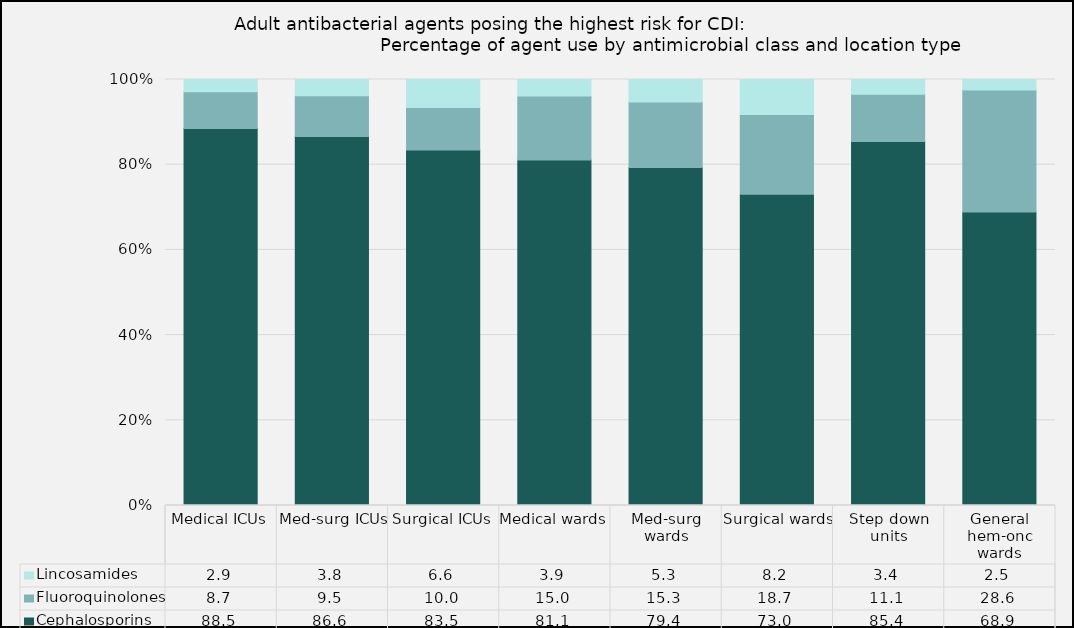
| Category | Cephalosporins | Fluoroquinolones | Lincosamides |
|---|---|---|---|
| Medical ICUs | 88.48 | 8.66 | 2.85 |
| Med-surg ICUs | 86.64 | 9.53 | 3.83 |
| Surgical ICUs | 83.45 | 10.01 | 6.55 |
| Medical wards | 81.13 | 14.99 | 3.88 |
| Med-surg wards | 79.37 | 15.33 | 5.3 |
| Surgical wards | 73.03 | 18.74 | 8.22 |
| Step down units | 85.42 | 11.14 | 3.44 |
| General hem-onc wards | 68.92 | 28.59 | 2.49 |